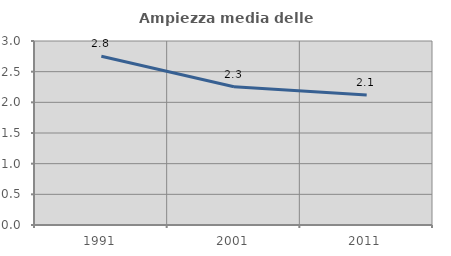
| Category | Ampiezza media delle famiglie |
|---|---|
| 1991.0 | 2.751 |
| 2001.0 | 2.253 |
| 2011.0 | 2.118 |